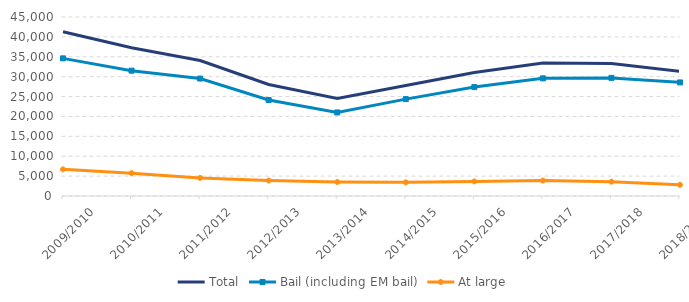
| Category | Total | Bail (including EM bail) | At large |
|---|---|---|---|
| 2009/2010 | 41305 | 34603 | 6702 |
| 2010/2011 | 37256 | 31509 | 5747 |
| 2011/2012 | 34074 | 29527 | 4547 |
| 2012/2013 | 28022 | 24129 | 3893 |
| 2013/2014 | 24532 | 21004 | 3528 |
| 2014/2015 | 27790 | 24355 | 3435 |
| 2015/2016 | 31043 | 27378 | 3665 |
| 2016/2017 | 33455 | 29574 | 3881 |
| 2017/2018 | 33300 | 29694 | 3606 |
| 2018/2019 | 31352 | 28551 | 2801 |